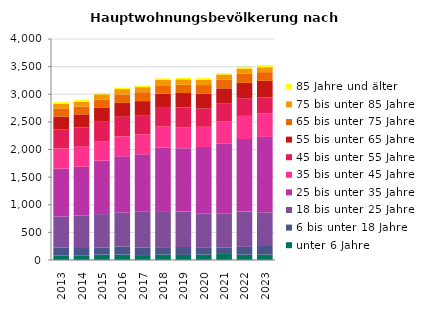
| Category | unter 6 Jahre | 6 bis unter 18 Jahre | 18 bis unter 25 Jahre | 25 bis unter 35 Jahre | 35 bis unter 45 Jahre | 45 bis unter 55 Jahre | 55 bis unter 65 Jahre | 65 bis unter 75 Jahre | 75 bis unter 85 Jahre | 85 Jahre und älter |
|---|---|---|---|---|---|---|---|---|---|---|
| 2013.0 | 83 | 146 | 560 | 866 | 365 | 347 | 230 | 149 | 83 | 29 |
| 2014.0 | 77 | 140 | 587 | 884 | 362 | 347 | 239 | 143 | 86 | 29 |
| 2015.0 | 98 | 131 | 602 | 968 | 353 | 362 | 248 | 143 | 92 | 26 |
| 2016.0 | 98 | 149 | 614 | 1016 | 359 | 356 | 251 | 152 | 98 | 26 |
| 2017.0 | 89 | 140 | 644 | 1040 | 359 | 350 | 254 | 161 | 92 | 29 |
| 2018.0 | 98 | 134 | 653 | 1151 | 377 | 341 | 257 | 152 | 95 | 29 |
| 2019.0 | 92 | 143 | 641 | 1148 | 380 | 356 | 263 | 149 | 98 | 29 |
| 2020.0 | 98 | 122 | 623 | 1202 | 365 | 329 | 269 | 158 | 98 | 26 |
| 2021.0 | 110 | 119 | 617 | 1262 | 404 | 326 | 269 | 161 | 89 | 26 |
| 2022.0 | 98 | 140 | 638 | 1313 | 419 | 320 | 278 | 164 | 95 | 32 |
| 2023.0 | 98 | 155 | 608 | 1367 | 422 | 293 | 299 | 158 | 89 | 38 |